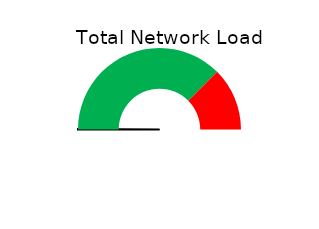
| Category | Pie |
|---|---|
| 0 | 0 |
| 1 | 0.1 |
| 2 | 59.9 |
| 3 | 60 |